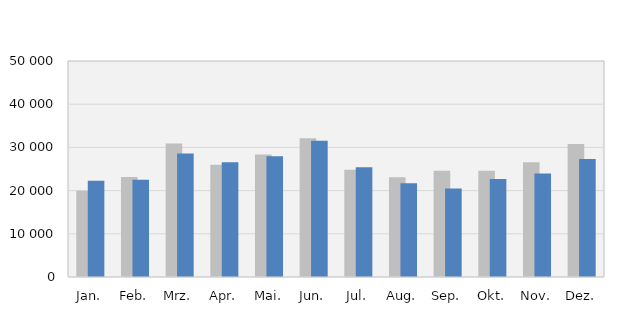
| Category | 2017 | 2018 |
|---|---|---|
| Jan. | 19994 | 22258 |
| Feb. | 23123 | 22536 |
| Mrz. | 30892 | 28581 |
| Apr. | 25995 | 26558 |
| Mai. | 28375 | 27942 |
| Jun. | 32141 | 31536 |
| Jul. | 24798 | 25379 |
| Aug. | 23111 | 21680 |
| Sep. | 24606 | 20462 |
| Okt. | 24614 | 22666 |
| Nov. | 26587 | 23986 |
| Dez. | 30796 | 27303 |